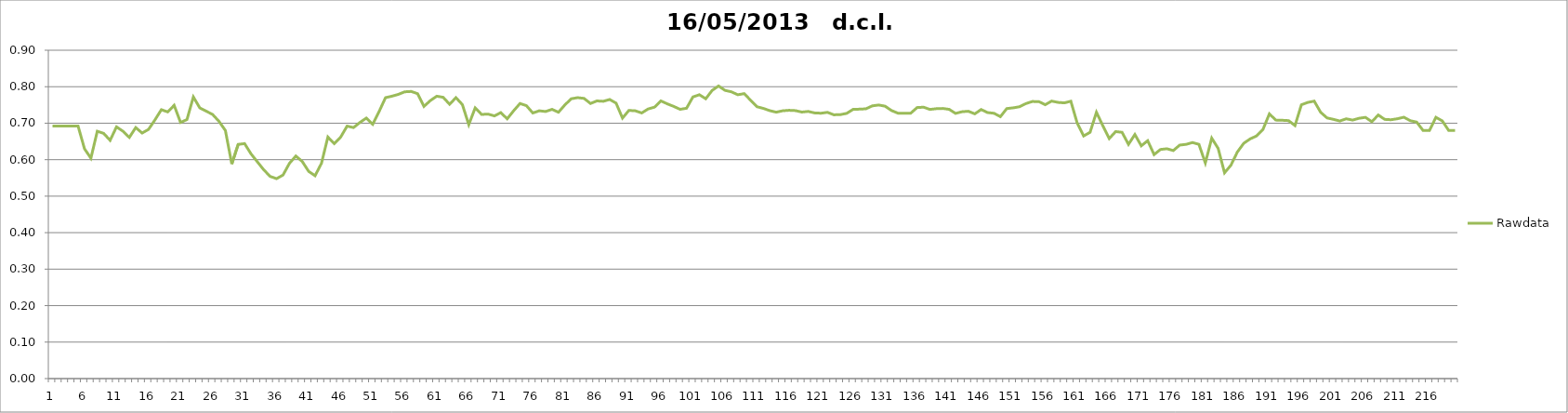
| Category | Rawdata |
|---|---|
| 0 | 0.692 |
| 1 | 0.692 |
| 2 | 0.692 |
| 3 | 0.692 |
| 4 | 0.692 |
| 5 | 0.63 |
| 6 | 0.604 |
| 7 | 0.678 |
| 8 | 0.672 |
| 9 | 0.653 |
| 10 | 0.69 |
| 11 | 0.678 |
| 12 | 0.661 |
| 13 | 0.688 |
| 14 | 0.673 |
| 15 | 0.683 |
| 16 | 0.709 |
| 17 | 0.737 |
| 18 | 0.731 |
| 19 | 0.749 |
| 20 | 0.702 |
| 21 | 0.71 |
| 22 | 0.772 |
| 23 | 0.742 |
| 24 | 0.733 |
| 25 | 0.724 |
| 26 | 0.705 |
| 27 | 0.68 |
| 28 | 0.588 |
| 29 | 0.642 |
| 30 | 0.644 |
| 31 | 0.616 |
| 32 | 0.594 |
| 33 | 0.572 |
| 34 | 0.554 |
| 35 | 0.548 |
| 36 | 0.558 |
| 37 | 0.59 |
| 38 | 0.61 |
| 39 | 0.595 |
| 40 | 0.568 |
| 41 | 0.556 |
| 42 | 0.59 |
| 43 | 0.662 |
| 44 | 0.644 |
| 45 | 0.662 |
| 46 | 0.692 |
| 47 | 0.688 |
| 48 | 0.702 |
| 49 | 0.714 |
| 50 | 0.697 |
| 51 | 0.732 |
| 52 | 0.77 |
| 53 | 0.774 |
| 54 | 0.779 |
| 55 | 0.786 |
| 56 | 0.787 |
| 57 | 0.781 |
| 58 | 0.746 |
| 59 | 0.762 |
| 60 | 0.774 |
| 61 | 0.771 |
| 62 | 0.752 |
| 63 | 0.77 |
| 64 | 0.751 |
| 65 | 0.696 |
| 66 | 0.742 |
| 67 | 0.724 |
| 68 | 0.725 |
| 69 | 0.72 |
| 70 | 0.729 |
| 71 | 0.712 |
| 72 | 0.734 |
| 73 | 0.754 |
| 74 | 0.748 |
| 75 | 0.728 |
| 76 | 0.734 |
| 77 | 0.732 |
| 78 | 0.738 |
| 79 | 0.73 |
| 80 | 0.75 |
| 81 | 0.767 |
| 82 | 0.77 |
| 83 | 0.768 |
| 84 | 0.754 |
| 85 | 0.761 |
| 86 | 0.76 |
| 87 | 0.765 |
| 88 | 0.755 |
| 89 | 0.714 |
| 90 | 0.735 |
| 91 | 0.734 |
| 92 | 0.728 |
| 93 | 0.739 |
| 94 | 0.744 |
| 95 | 0.761 |
| 96 | 0.753 |
| 97 | 0.746 |
| 98 | 0.738 |
| 99 | 0.741 |
| 100 | 0.772 |
| 101 | 0.778 |
| 102 | 0.767 |
| 103 | 0.79 |
| 104 | 0.802 |
| 105 | 0.79 |
| 106 | 0.786 |
| 107 | 0.778 |
| 108 | 0.781 |
| 109 | 0.763 |
| 110 | 0.745 |
| 111 | 0.741 |
| 112 | 0.734 |
| 113 | 0.73 |
| 114 | 0.734 |
| 115 | 0.735 |
| 116 | 0.735 |
| 117 | 0.731 |
| 118 | 0.732 |
| 119 | 0.728 |
| 120 | 0.727 |
| 121 | 0.73 |
| 122 | 0.723 |
| 123 | 0.724 |
| 124 | 0.727 |
| 125 | 0.738 |
| 126 | 0.739 |
| 127 | 0.739 |
| 128 | 0.748 |
| 129 | 0.75 |
| 130 | 0.747 |
| 131 | 0.735 |
| 132 | 0.728 |
| 133 | 0.727 |
| 134 | 0.727 |
| 135 | 0.743 |
| 136 | 0.744 |
| 137 | 0.738 |
| 138 | 0.74 |
| 139 | 0.74 |
| 140 | 0.738 |
| 141 | 0.727 |
| 142 | 0.731 |
| 143 | 0.733 |
| 144 | 0.726 |
| 145 | 0.738 |
| 146 | 0.729 |
| 147 | 0.727 |
| 148 | 0.718 |
| 149 | 0.74 |
| 150 | 0.742 |
| 151 | 0.745 |
| 152 | 0.754 |
| 153 | 0.76 |
| 154 | 0.759 |
| 155 | 0.751 |
| 156 | 0.761 |
| 157 | 0.757 |
| 158 | 0.756 |
| 159 | 0.76 |
| 160 | 0.7 |
| 161 | 0.665 |
| 162 | 0.675 |
| 163 | 0.73 |
| 164 | 0.693 |
| 165 | 0.658 |
| 166 | 0.677 |
| 167 | 0.675 |
| 168 | 0.642 |
| 169 | 0.669 |
| 170 | 0.638 |
| 171 | 0.652 |
| 172 | 0.614 |
| 173 | 0.628 |
| 174 | 0.63 |
| 175 | 0.625 |
| 176 | 0.64 |
| 177 | 0.642 |
| 178 | 0.647 |
| 179 | 0.642 |
| 180 | 0.591 |
| 181 | 0.659 |
| 182 | 0.631 |
| 183 | 0.564 |
| 184 | 0.585 |
| 185 | 0.621 |
| 186 | 0.645 |
| 187 | 0.657 |
| 188 | 0.665 |
| 189 | 0.683 |
| 190 | 0.726 |
| 191 | 0.708 |
| 192 | 0.708 |
| 193 | 0.707 |
| 194 | 0.694 |
| 195 | 0.75 |
| 196 | 0.757 |
| 197 | 0.76 |
| 198 | 0.73 |
| 199 | 0.714 |
| 200 | 0.71 |
| 201 | 0.706 |
| 202 | 0.712 |
| 203 | 0.708 |
| 204 | 0.714 |
| 205 | 0.716 |
| 206 | 0.704 |
| 207 | 0.722 |
| 208 | 0.71 |
| 209 | 0.71 |
| 210 | 0.712 |
| 211 | 0.716 |
| 212 | 0.707 |
| 213 | 0.703 |
| 214 | 0.68 |
| 215 | 0.68 |
| 216 | 0.716 |
| 217 | 0.706 |
| 218 | 0.68 |
| 219 | 0.68 |